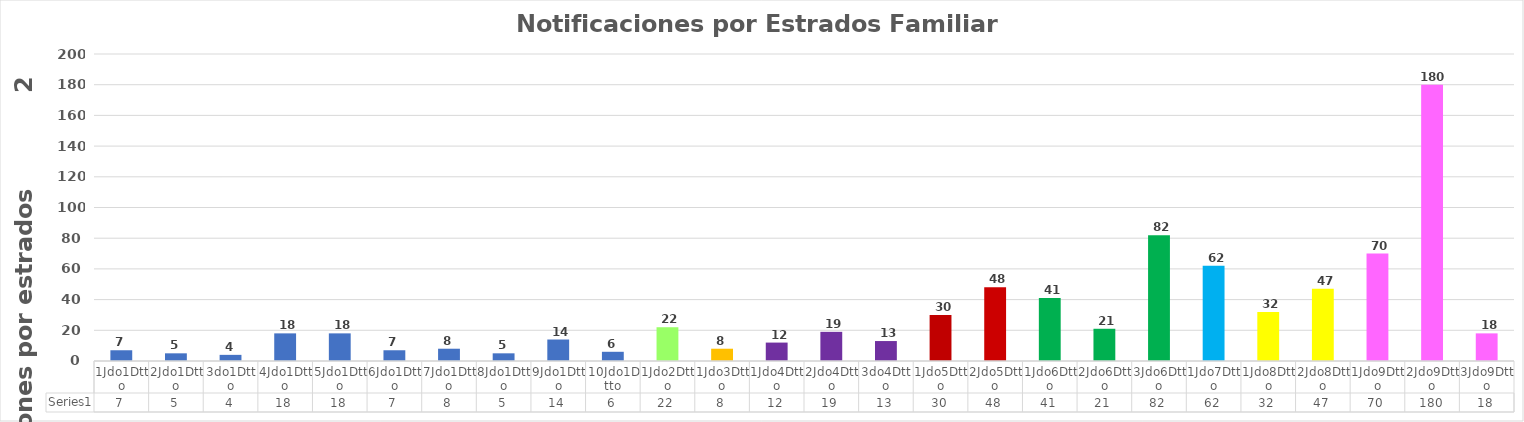
| Category | Series 0 |
|---|---|
| 1Jdo1Dtto | 7 |
| 2Jdo1Dtto | 5 |
| 3do1Dtto | 4 |
| 4Jdo1Dtto | 18 |
| 5Jdo1Dtto | 18 |
| 6Jdo1Dtto | 7 |
| 7Jdo1Dtto | 8 |
| 8Jdo1Dtto | 5 |
| 9Jdo1Dtto | 14 |
| 10Jdo1Dtto | 6 |
| 1Jdo2Dtto | 22 |
| 1Jdo3Dtto | 8 |
| 1Jdo4Dtto | 12 |
| 2Jdo4Dtto | 19 |
| 3do4Dtto | 13 |
| 1Jdo5Dtto | 30 |
| 2Jdo5Dtto | 48 |
| 1Jdo6Dtto | 41 |
| 2Jdo6Dtto | 21 |
| 3Jdo6Dtto | 82 |
| 1Jdo7Dtto | 62 |
| 1Jdo8Dtto | 32 |
| 2Jdo8Dtto | 47 |
| 1Jdo9Dtto | 70 |
| 2Jdo9Dtto | 180 |
| 3Jdo9Dtto | 18 |